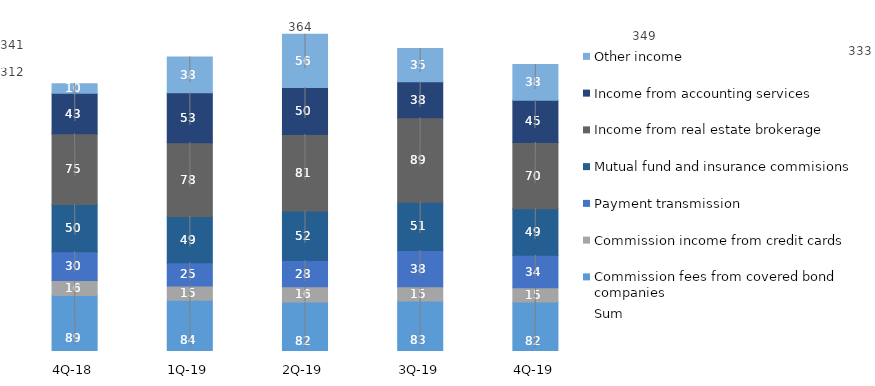
| Category | Commission fees from covered bond companies | Commission income from credit cards | Payment transmission | Mutual fund and insurance commisions | Income from real estate brokerage | Income from accounting services | Other income |
|---|---|---|---|---|---|---|---|
| 4Q-19 | 82.3 | 14.8 | 34.4 | 49.1 | 69.7 | 44.5 | 37.8 |
| 3Q-19 | 83.345 | 15 | 38 | 51 | 89 | 38 | 35 |
| 2Q-19 | 82.097 | 16.08 | 27.71 | 52.19 | 80.63 | 49.6 | 56.1 |
| 1Q-19 | 84.154 | 14.808 | 24.665 | 48.809 | 77.601 | 52.707 | 37.808 |
| 4Q-18 | 88.946 | 15.972 | 30.264 | 49.714 | 74.631 | 42.743 | 10.109 |